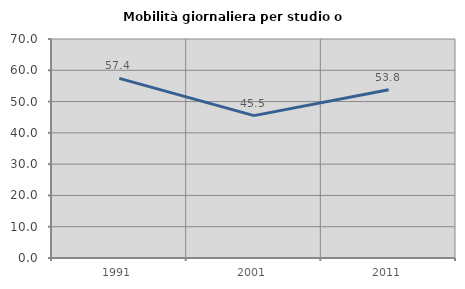
| Category | Mobilità giornaliera per studio o lavoro |
|---|---|
| 1991.0 | 57.43 |
| 2001.0 | 45.5 |
| 2011.0 | 53.75 |